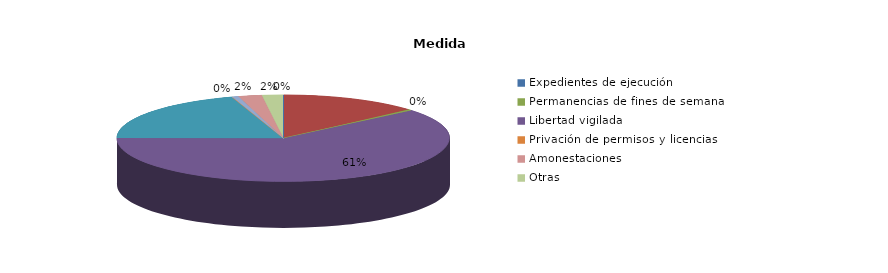
| Category | Series 0 |
|---|---|
| Expedientes de ejecución | 0 |
| Internamientos | 65 |
| Permanencias de fines de semana | 2 |
| Libertad vigilada | 295 |
| Prestaciones en beneficio de la comunidad | 96 |
| Privación de permisos y licencias | 0 |
| Convivencia Familiar Educativa | 3 |
| Amonestaciones | 11 |
| Otras | 10 |